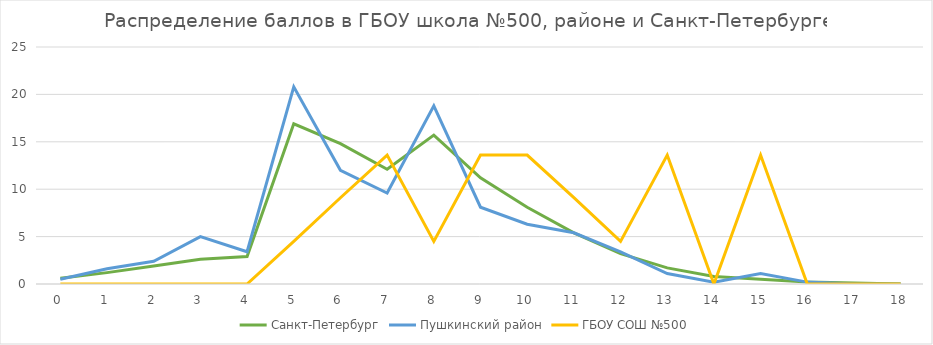
| Category | Санкт-Петербург | Пушкинский район | ГБОУ СОШ №500 |
|---|---|---|---|
| 0.0 | 0.6 | 0.5 | 0 |
| 1.0 | 1.2 | 1.6 | 0 |
| 2.0 | 1.9 | 2.4 | 0 |
| 3.0 | 2.6 | 5 | 0 |
| 4.0 | 2.9 | 3.4 | 0 |
| 5.0 | 16.9 | 20.8 | 4.5 |
| 6.0 | 14.8 | 12 | 9.1 |
| 7.0 | 12.1 | 9.6 | 13.6 |
| 8.0 | 15.7 | 18.8 | 4.5 |
| 9.0 | 11.2 | 8.1 | 13.6 |
| 10.0 | 8.1 | 6.3 | 13.6 |
| 11.0 | 5.4 | 5.4 | 9.1 |
| 12.0 | 3.2 | 3.4 | 4.5 |
| 13.0 | 1.7 | 1.1 | 13.6 |
| 14.0 | 0.8 | 0.2 | 0 |
| 15.0 | 0.5 | 1.1 | 13.6 |
| 16.0 | 0.2 | 0.2 | 0 |
| 17.0 | 0.1 | 0 | 0 |
| 18.0 | 0 | 0 | 0 |